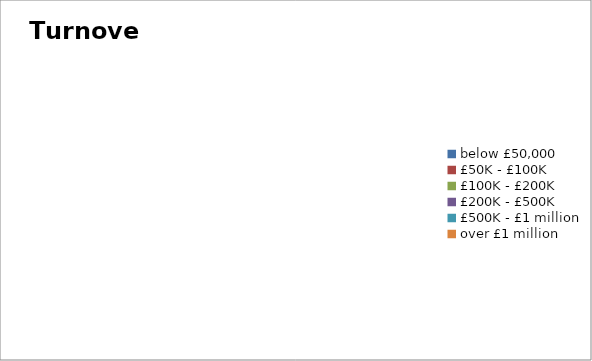
| Category | Series 0 |
|---|---|
| below £50,000 | 0 |
| £50K - £100K | 0 |
| £100K - £200K | 0 |
| £200K - £500K | 0 |
| £500K - £1 million | 0 |
| over £1 million | 0 |